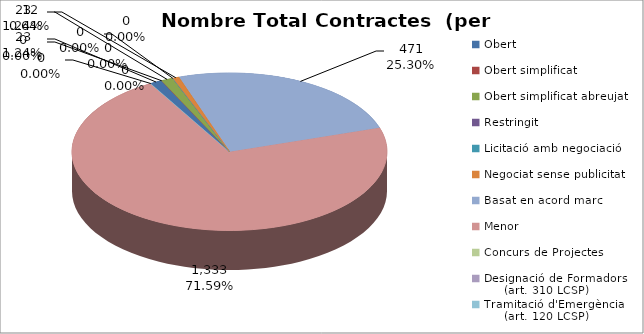
| Category | Nombre Total Contractes |
|---|---|
| Obert | 23 |
| Obert simplificat | 0 |
| Obert simplificat abreujat | 23 |
| Restringit | 0 |
| Licitació amb negociació | 0 |
| Negociat sense publicitat | 12 |
| Basat en acord marc | 471 |
| Menor | 1333 |
| Concurs de Projectes | 0 |
| Designació de Formadors
     (art. 310 LCSP) | 0 |
| Tramitació d'Emergència
     (art. 120 LCSP) | 0 |